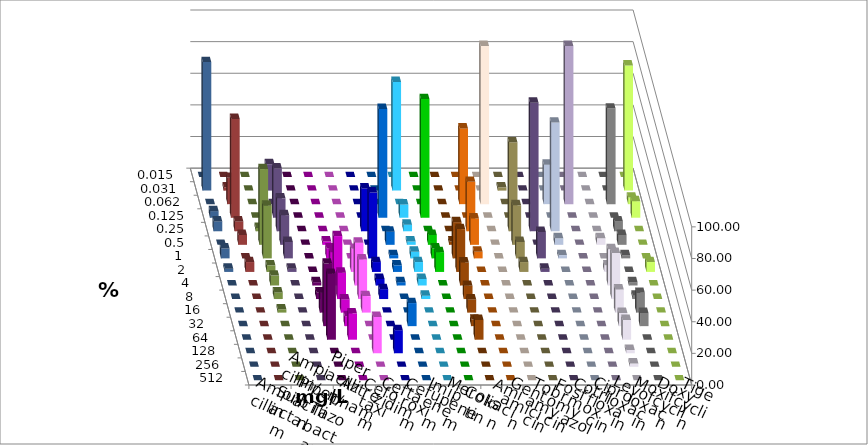
| Category | Ampicillin | Ampicillin/ Sulbactam | Piperacillin | Piperacillin/ Tazobactam | Aztreonam | Cefotaxim | Ceftazidim | Cefuroxim | Imipenem | Meropenem | Colistin | Amikacin | Gentamicin | Tobramycin | Fosfomycin | Cotrimoxazol | Ciprofloxacin | Levofloxacin | Moxifloxacin | Doxycyclin | Tigecyclin |
|---|---|---|---|---|---|---|---|---|---|---|---|---|---|---|---|---|---|---|---|---|---|
| 0.015 | 0 | 0 | 0 | 0 | 0 | 0 | 0 | 0 | 0 | 0 | 0 | 0 | 0 | 0 | 0 | 0 | 0 | 0 | 0 | 0 | 0 |
| 0.031 | 0 | 0 | 0 | 0 | 0 | 68.75 | 0 | 0 | 0 | 0 | 2.083 | 0 | 0 | 0 | 0 | 0 | 79.167 | 81.25 | 2.083 | 0 | 16.667 |
| 0.062 | 0 | 0 | 0 | 0 | 0 | 0 | 0 | 0 | 47.917 | 100 | 0 | 0 | 25 | 100 | 0 | 60.417 | 4.167 | 0 | 16.667 | 0 | 0 |
| 0.125 | 0 | 0 | 0 | 0 | 68.75 | 8.333 | 75 | 0 | 0 | 0 | 0 | 0 | 0 | 0 | 0 | 0 | 10.417 | 4.167 | 62.5 | 0 | 31.25 |
| 0.25 | 0 | 0 | 0 | 27.083 | 0 | 4.167 | 0 | 0 | 31.25 | 0 | 56.25 | 81.25 | 68.75 | 0 | 0 | 6.25 | 0 | 6.25 | 6.25 | 2.083 | 20.833 |
| 0.5 | 0 | 2.083 | 0 | 0 | 8.333 | 2.083 | 6.25 | 2.083 | 16.667 | 0 | 25 | 0 | 4.167 | 0 | 4.167 | 6.25 | 0 | 0 | 6.25 | 47.917 | 18.75 |
| 1.0 | 0 | 6.25 | 0 | 41.667 | 2.083 | 4.167 | 6.25 | 22.917 | 4.167 | 0 | 10.417 | 16.667 | 2.083 | 0 | 0 | 2.083 | 0 | 6.25 | 0 | 33.333 | 10.417 |
| 2.0 | 0 | 12.5 | 14.583 | 6.25 | 4.167 | 6.25 | 12.5 | 27.083 | 0 | 0 | 6.25 | 2.083 | 0 | 0 | 4.167 | 0 | 6.25 | 2.083 | 6.25 | 4.167 | 2.083 |
| 4.0 | 2.083 | 31.25 | 27.083 | 4.167 | 2.083 | 4.167 | 0 | 14.583 | 0 | 0 | 0 | 0 | 0 | 0 | 22.917 | 2.083 | 0 | 0 | 0 | 6.25 | 0 |
| 8.0 | 4.167 | 16.667 | 25 | 6.25 | 0 | 2.083 | 0 | 8.333 | 0 | 0 | 0 | 0 | 0 | 0 | 29.167 | 2.083 | 0 | 0 | 0 | 4.167 | 0 |
| 16.0 | 12.5 | 8.333 | 10.417 | 0 | 0 | 0 | 0 | 8.333 | 0 | 0 | 0 | 0 | 0 | 0 | 14.583 | 12.5 | 0 | 0 | 0 | 2.083 | 0 |
| 32.0 | 39.583 | 6.25 | 0 | 0 | 14.583 | 0 | 0 | 4.167 | 0 | 0 | 0 | 0 | 0 | 0 | 8.333 | 8.333 | 0 | 0 | 0 | 0 | 0 |
| 64.0 | 41.667 | 16.667 | 0 | 0 | 0 | 0 | 0 | 12.5 | 0 | 0 | 0 | 0 | 0 | 0 | 12.5 | 0 | 0 | 0 | 0 | 0 | 0 |
| 128.0 | 0 | 0 | 22.917 | 14.583 | 0 | 0 | 0 | 0 | 0 | 0 | 0 | 0 | 0 | 0 | 2.083 | 0 | 0 | 0 | 0 | 0 | 0 |
| 256.0 | 0 | 0 | 0 | 0 | 0 | 0 | 0 | 0 | 0 | 0 | 0 | 0 | 0 | 0 | 2.083 | 0 | 0 | 0 | 0 | 0 | 0 |
| 512.0 | 0 | 0 | 0 | 0 | 0 | 0 | 0 | 0 | 0 | 0 | 0 | 0 | 0 | 0 | 0 | 0 | 0 | 0 | 0 | 0 | 0 |